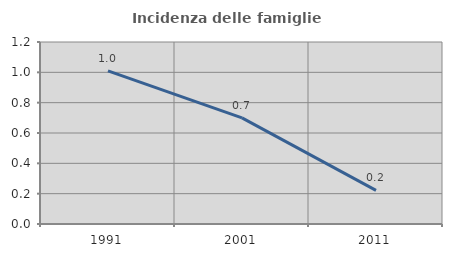
| Category | Incidenza delle famiglie numerose |
|---|---|
| 1991.0 | 1.01 |
| 2001.0 | 0.699 |
| 2011.0 | 0.222 |